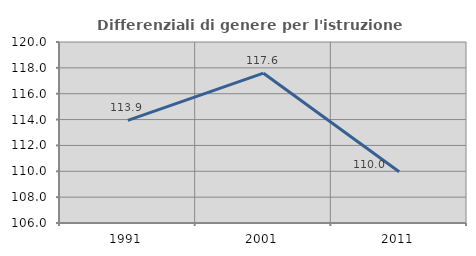
| Category | Differenziali di genere per l'istruzione superiore |
|---|---|
| 1991.0 | 113.933 |
| 2001.0 | 117.589 |
| 2011.0 | 109.959 |